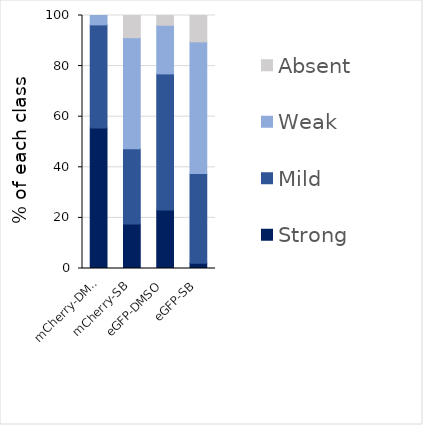
| Category | Strong | Mild | Weak | Absent |
|---|---|---|---|---|
| mCherry-DMSO | 55.556 | 40.741 | 3.704 | 0 |
| mCherry-SB | 17.544 | 29.825 | 43.86 | 8.772 |
| eGFP-DMSO | 23.077 | 53.846 | 19.231 | 3.846 |
| eGFP-SB | 2.083 | 35.417 | 52.083 | 10.417 |